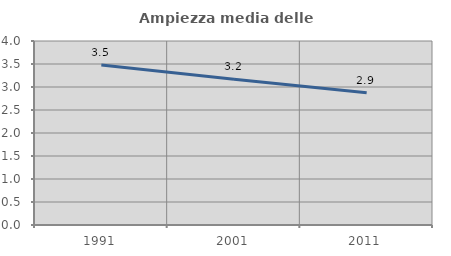
| Category | Ampiezza media delle famiglie |
|---|---|
| 1991.0 | 3.479 |
| 2001.0 | 3.166 |
| 2011.0 | 2.874 |